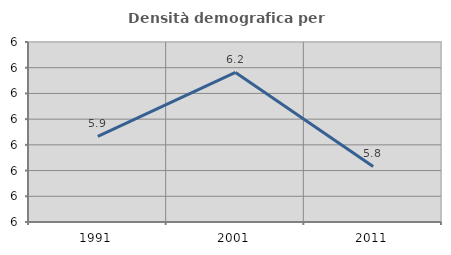
| Category | Densità demografica |
|---|---|
| 1991.0 | 5.933 |
| 2001.0 | 6.181 |
| 2011.0 | 5.816 |